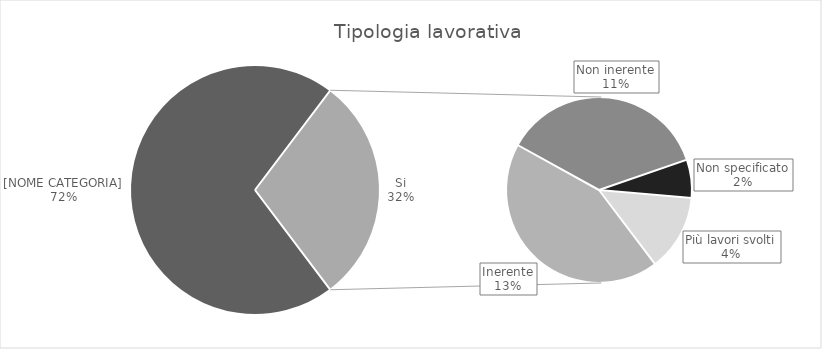
| Category | Series 0 |
|---|---|
| No  | 72 |
| Inerente | 13 |
| Non inerente | 11 |
| Non specificato | 2 |
| Più lavori svolti | 4 |